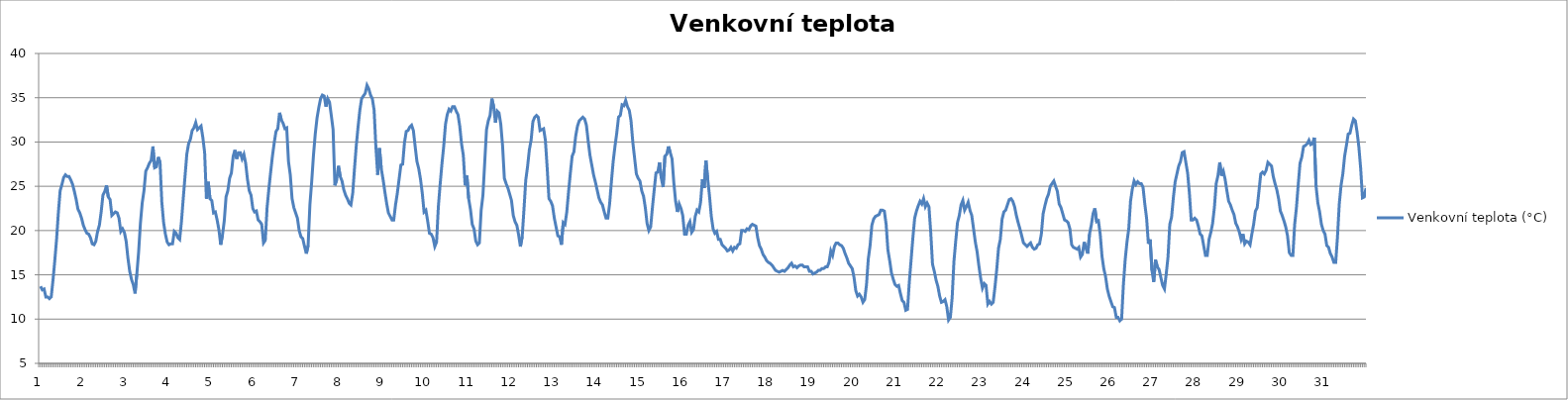
| Category | Venkovní teplota (°C) |
|---|---|
| 0 | 13.7 |
| 1 | 13.3 |
| 2 | 13.4 |
| 3 | 12.5 |
| 4 | 12.5 |
| 5 | 12.3 |
| 6 | 12.5 |
| 7 | 14.4 |
| 8 | 16.6 |
| 9 | 19 |
| 10 | 22 |
| 11 | 24.5 |
| 12 | 25.2 |
| 13 | 26 |
| 14 | 26.3 |
| 15 | 26.1 |
| 16 | 26.1 |
| 17 | 25.7 |
| 18 | 25.2 |
| 19 | 24.4 |
| 20 | 23.5 |
| 21 | 22.4 |
| 22 | 22 |
| 23 | 21.4 |
| 24 | 20.6 |
| 25 | 20.1 |
| 26 | 19.7 |
| 27 | 19.6 |
| 28 | 19.2 |
| 29 | 18.5 |
| 30 | 18.4 |
| 31 | 18.8 |
| 32 | 19.9 |
| 33 | 20.6 |
| 34 | 22.1 |
| 35 | 24 |
| 36 | 24.4 |
| 37 | 25.1 |
| 38 | 23.8 |
| 39 | 23.5 |
| 40 | 21.7 |
| 41 | 21.9 |
| 42 | 22.1 |
| 43 | 22 |
| 44 | 21.4 |
| 45 | 19.9 |
| 46 | 20.2 |
| 47 | 19.8 |
| 48 | 18.8 |
| 49 | 16.9 |
| 50 | 15.4 |
| 51 | 14.5 |
| 52 | 13.9 |
| 53 | 12.9 |
| 54 | 15.1 |
| 55 | 17.6 |
| 56 | 20.8 |
| 57 | 23.1 |
| 58 | 24.5 |
| 59 | 26.7 |
| 60 | 27.1 |
| 61 | 27.6 |
| 62 | 27.9 |
| 63 | 29.5 |
| 64 | 27.1 |
| 65 | 27.2 |
| 66 | 28.3 |
| 67 | 27.7 |
| 68 | 23.2 |
| 69 | 20.9 |
| 70 | 19.6 |
| 71 | 18.7 |
| 72 | 18.4 |
| 73 | 18.5 |
| 74 | 18.5 |
| 75 | 19.9 |
| 76 | 19.7 |
| 77 | 19.2 |
| 78 | 19 |
| 79 | 21 |
| 80 | 23.6 |
| 81 | 26.1 |
| 82 | 28.6 |
| 83 | 29.8 |
| 84 | 30.3 |
| 85 | 31.3 |
| 86 | 31.6 |
| 87 | 32.2 |
| 88 | 31.4 |
| 89 | 31.6 |
| 90 | 31.8 |
| 91 | 30.5 |
| 92 | 28.8 |
| 93 | 23.6 |
| 94 | 25.5 |
| 95 | 23.6 |
| 96 | 23.4 |
| 97 | 22 |
| 98 | 22.1 |
| 99 | 21.2 |
| 100 | 20.1 |
| 101 | 18.4 |
| 102 | 19.5 |
| 103 | 21.1 |
| 104 | 23.8 |
| 105 | 24.5 |
| 106 | 25.9 |
| 107 | 26.5 |
| 108 | 28.4 |
| 109 | 29.1 |
| 110 | 28.1 |
| 111 | 28.8 |
| 112 | 28.8 |
| 113 | 28.1 |
| 114 | 28.6 |
| 115 | 27.6 |
| 116 | 25.8 |
| 117 | 24.5 |
| 118 | 24 |
| 119 | 22.5 |
| 120 | 22.1 |
| 121 | 22.2 |
| 122 | 21.2 |
| 123 | 21 |
| 124 | 20.7 |
| 125 | 18.6 |
| 126 | 18.9 |
| 127 | 22.6 |
| 128 | 24.7 |
| 129 | 26.6 |
| 130 | 28.4 |
| 131 | 29.9 |
| 132 | 31.2 |
| 133 | 31.5 |
| 134 | 33.3 |
| 135 | 32.5 |
| 136 | 32.1 |
| 137 | 31.5 |
| 138 | 31.6 |
| 139 | 27.8 |
| 140 | 26.3 |
| 141 | 23.6 |
| 142 | 22.6 |
| 143 | 22 |
| 144 | 21.4 |
| 145 | 20 |
| 146 | 19.3 |
| 147 | 19.1 |
| 148 | 18.2 |
| 149 | 17.4 |
| 150 | 18.3 |
| 151 | 22.9 |
| 152 | 25.5 |
| 153 | 28.5 |
| 154 | 30.9 |
| 155 | 32.7 |
| 156 | 33.9 |
| 157 | 34.9 |
| 158 | 35.3 |
| 159 | 35.2 |
| 160 | 34 |
| 161 | 34.9 |
| 162 | 34.5 |
| 163 | 33 |
| 164 | 31.4 |
| 165 | 25.1 |
| 166 | 25.7 |
| 167 | 27.3 |
| 168 | 26.1 |
| 169 | 25.6 |
| 170 | 24.6 |
| 171 | 24 |
| 172 | 23.6 |
| 173 | 23.1 |
| 174 | 22.9 |
| 175 | 24.2 |
| 176 | 27 |
| 177 | 29.6 |
| 178 | 31.7 |
| 179 | 33.6 |
| 180 | 34.9 |
| 181 | 35.2 |
| 182 | 35.5 |
| 183 | 36.4 |
| 184 | 36 |
| 185 | 35.3 |
| 186 | 34.9 |
| 187 | 33.6 |
| 188 | 29.4 |
| 189 | 26.3 |
| 190 | 29.3 |
| 191 | 27 |
| 192 | 25.8 |
| 193 | 24.4 |
| 194 | 23.1 |
| 195 | 22 |
| 196 | 21.6 |
| 197 | 21.2 |
| 198 | 21.2 |
| 199 | 22.9 |
| 200 | 24.2 |
| 201 | 25.8 |
| 202 | 27.4 |
| 203 | 27.5 |
| 204 | 29.9 |
| 205 | 31.2 |
| 206 | 31.3 |
| 207 | 31.7 |
| 208 | 31.9 |
| 209 | 31.3 |
| 210 | 29.5 |
| 211 | 27.8 |
| 212 | 27 |
| 213 | 25.8 |
| 214 | 24.2 |
| 215 | 22.1 |
| 216 | 22.3 |
| 217 | 21.1 |
| 218 | 19.7 |
| 219 | 19.6 |
| 220 | 19.2 |
| 221 | 18.2 |
| 222 | 18.7 |
| 223 | 22.7 |
| 224 | 25.2 |
| 225 | 27.5 |
| 226 | 29.5 |
| 227 | 32 |
| 228 | 33.1 |
| 229 | 33.7 |
| 230 | 33.5 |
| 231 | 34 |
| 232 | 34 |
| 233 | 33.5 |
| 234 | 33.1 |
| 235 | 31.8 |
| 236 | 29.8 |
| 237 | 28.5 |
| 238 | 25.1 |
| 239 | 26.2 |
| 240 | 23.6 |
| 241 | 22.4 |
| 242 | 20.7 |
| 243 | 20.2 |
| 244 | 18.8 |
| 245 | 18.4 |
| 246 | 18.6 |
| 247 | 22.3 |
| 248 | 24 |
| 249 | 27.7 |
| 250 | 31.4 |
| 251 | 32.4 |
| 252 | 33 |
| 253 | 34.9 |
| 254 | 34 |
| 255 | 32.2 |
| 256 | 33.5 |
| 257 | 33.3 |
| 258 | 32 |
| 259 | 29.6 |
| 260 | 25.9 |
| 261 | 25.3 |
| 262 | 24.8 |
| 263 | 24.1 |
| 264 | 23.4 |
| 265 | 21.7 |
| 266 | 21 |
| 267 | 20.6 |
| 268 | 19.5 |
| 269 | 18.2 |
| 270 | 19.3 |
| 271 | 22.4 |
| 272 | 25.7 |
| 273 | 27.2 |
| 274 | 29.1 |
| 275 | 30.2 |
| 276 | 32.3 |
| 277 | 32.8 |
| 278 | 33 |
| 279 | 32.8 |
| 280 | 31.3 |
| 281 | 31.4 |
| 282 | 31.5 |
| 283 | 30.2 |
| 284 | 27.1 |
| 285 | 23.6 |
| 286 | 23.3 |
| 287 | 22.8 |
| 288 | 21.4 |
| 289 | 20.4 |
| 290 | 19.4 |
| 291 | 19.3 |
| 292 | 18.4 |
| 293 | 20.9 |
| 294 | 20.7 |
| 295 | 22.1 |
| 296 | 24.4 |
| 297 | 26.5 |
| 298 | 28.4 |
| 299 | 28.9 |
| 300 | 30.7 |
| 301 | 31.8 |
| 302 | 32.4 |
| 303 | 32.6 |
| 304 | 32.8 |
| 305 | 32.6 |
| 306 | 31.9 |
| 307 | 30.1 |
| 308 | 28.5 |
| 309 | 27.4 |
| 310 | 26.3 |
| 311 | 25.5 |
| 312 | 24.6 |
| 313 | 23.7 |
| 314 | 23.2 |
| 315 | 22.9 |
| 316 | 22.1 |
| 317 | 21.4 |
| 318 | 21.4 |
| 319 | 23 |
| 320 | 25.5 |
| 321 | 27.8 |
| 322 | 29.5 |
| 323 | 31 |
| 324 | 32.8 |
| 325 | 33 |
| 326 | 34.2 |
| 327 | 34.1 |
| 328 | 34.7 |
| 329 | 34 |
| 330 | 33.6 |
| 331 | 32.4 |
| 332 | 30 |
| 333 | 28.2 |
| 334 | 26.4 |
| 335 | 25.9 |
| 336 | 25.6 |
| 337 | 24.5 |
| 338 | 23.9 |
| 339 | 22.6 |
| 340 | 20.8 |
| 341 | 20 |
| 342 | 20.4 |
| 343 | 22.6 |
| 344 | 24.6 |
| 345 | 26.5 |
| 346 | 26.6 |
| 347 | 27.7 |
| 348 | 25.9 |
| 349 | 24.9 |
| 350 | 28.4 |
| 351 | 28.6 |
| 352 | 29.5 |
| 353 | 28.8 |
| 354 | 28.1 |
| 355 | 25.4 |
| 356 | 23.3 |
| 357 | 22.1 |
| 358 | 23 |
| 359 | 22.5 |
| 360 | 21.7 |
| 361 | 19.6 |
| 362 | 19.6 |
| 363 | 20.6 |
| 364 | 21 |
| 365 | 19.8 |
| 366 | 20.1 |
| 367 | 21.6 |
| 368 | 22.3 |
| 369 | 22.1 |
| 370 | 23.2 |
| 371 | 25.8 |
| 372 | 24.8 |
| 373 | 27.9 |
| 374 | 25.8 |
| 375 | 23.9 |
| 376 | 21.6 |
| 377 | 20.2 |
| 378 | 19.7 |
| 379 | 19.9 |
| 380 | 19 |
| 381 | 19 |
| 382 | 18.4 |
| 383 | 18.2 |
| 384 | 18 |
| 385 | 17.7 |
| 386 | 17.8 |
| 387 | 18.1 |
| 388 | 17.7 |
| 389 | 18.1 |
| 390 | 18 |
| 391 | 18.4 |
| 392 | 18.5 |
| 393 | 20 |
| 394 | 20 |
| 395 | 19.9 |
| 396 | 20.2 |
| 397 | 20.1 |
| 398 | 20.5 |
| 399 | 20.7 |
| 400 | 20.6 |
| 401 | 20.5 |
| 402 | 19.2 |
| 403 | 18.3 |
| 404 | 17.9 |
| 405 | 17.3 |
| 406 | 17 |
| 407 | 16.6 |
| 408 | 16.4 |
| 409 | 16.3 |
| 410 | 16.1 |
| 411 | 15.8 |
| 412 | 15.5 |
| 413 | 15.4 |
| 414 | 15.3 |
| 415 | 15.4 |
| 416 | 15.5 |
| 417 | 15.4 |
| 418 | 15.6 |
| 419 | 15.8 |
| 420 | 16.1 |
| 421 | 16.3 |
| 422 | 15.9 |
| 423 | 16 |
| 424 | 15.8 |
| 425 | 16 |
| 426 | 16.1 |
| 427 | 16.1 |
| 428 | 15.9 |
| 429 | 15.9 |
| 430 | 15.9 |
| 431 | 15.4 |
| 432 | 15.4 |
| 433 | 15.1 |
| 434 | 15.2 |
| 435 | 15.3 |
| 436 | 15.5 |
| 437 | 15.5 |
| 438 | 15.7 |
| 439 | 15.7 |
| 440 | 15.9 |
| 441 | 15.9 |
| 442 | 16.4 |
| 443 | 17.7 |
| 444 | 17.2 |
| 445 | 18.2 |
| 446 | 18.6 |
| 447 | 18.6 |
| 448 | 18.4 |
| 449 | 18.3 |
| 450 | 18 |
| 451 | 17.4 |
| 452 | 16.9 |
| 453 | 16.3 |
| 454 | 16 |
| 455 | 15.7 |
| 456 | 14.7 |
| 457 | 13.2 |
| 458 | 12.6 |
| 459 | 12.8 |
| 460 | 12.5 |
| 461 | 11.9 |
| 462 | 12.2 |
| 463 | 13.9 |
| 464 | 16.8 |
| 465 | 18.3 |
| 466 | 20.6 |
| 467 | 21.3 |
| 468 | 21.6 |
| 469 | 21.7 |
| 470 | 21.8 |
| 471 | 22.3 |
| 472 | 22.3 |
| 473 | 22.2 |
| 474 | 20.7 |
| 475 | 17.8 |
| 476 | 16.6 |
| 477 | 15.2 |
| 478 | 14.5 |
| 479 | 13.9 |
| 480 | 13.7 |
| 481 | 13.8 |
| 482 | 12.9 |
| 483 | 12.1 |
| 484 | 11.9 |
| 485 | 11 |
| 486 | 11.1 |
| 487 | 14.2 |
| 488 | 16.7 |
| 489 | 19.2 |
| 490 | 21.4 |
| 491 | 22.2 |
| 492 | 22.8 |
| 493 | 23.3 |
| 494 | 23 |
| 495 | 23.6 |
| 496 | 22.7 |
| 497 | 23.1 |
| 498 | 22.7 |
| 499 | 19.8 |
| 500 | 16.2 |
| 501 | 15.4 |
| 502 | 14.4 |
| 503 | 13.7 |
| 504 | 12.6 |
| 505 | 11.9 |
| 506 | 12 |
| 507 | 12.2 |
| 508 | 11.4 |
| 509 | 9.9 |
| 510 | 10.2 |
| 511 | 12.4 |
| 512 | 16.5 |
| 513 | 18.8 |
| 514 | 20.9 |
| 515 | 21.7 |
| 516 | 22.9 |
| 517 | 23.4 |
| 518 | 22.3 |
| 519 | 22.7 |
| 520 | 23.2 |
| 521 | 22.3 |
| 522 | 21.7 |
| 523 | 20.2 |
| 524 | 18.7 |
| 525 | 17.6 |
| 526 | 16 |
| 527 | 14.6 |
| 528 | 13.5 |
| 529 | 14 |
| 530 | 13.8 |
| 531 | 11.7 |
| 532 | 12 |
| 533 | 11.7 |
| 534 | 11.9 |
| 535 | 13.6 |
| 536 | 15.6 |
| 537 | 18 |
| 538 | 19 |
| 539 | 21.3 |
| 540 | 22.1 |
| 541 | 22.3 |
| 542 | 22.9 |
| 543 | 23.5 |
| 544 | 23.6 |
| 545 | 23.3 |
| 546 | 22.7 |
| 547 | 21.7 |
| 548 | 20.9 |
| 549 | 20.2 |
| 550 | 19.4 |
| 551 | 18.6 |
| 552 | 18.4 |
| 553 | 18.2 |
| 554 | 18.4 |
| 555 | 18.6 |
| 556 | 18.1 |
| 557 | 17.9 |
| 558 | 18 |
| 559 | 18.4 |
| 560 | 18.5 |
| 561 | 19.6 |
| 562 | 21.9 |
| 563 | 22.8 |
| 564 | 23.6 |
| 565 | 24.1 |
| 566 | 25 |
| 567 | 25.3 |
| 568 | 25.6 |
| 569 | 25 |
| 570 | 24.4 |
| 571 | 23 |
| 572 | 22.6 |
| 573 | 21.9 |
| 574 | 21.2 |
| 575 | 21.1 |
| 576 | 20.9 |
| 577 | 20.2 |
| 578 | 18.4 |
| 579 | 18.1 |
| 580 | 18 |
| 581 | 17.9 |
| 582 | 18.1 |
| 583 | 17 |
| 584 | 17.3 |
| 585 | 18.7 |
| 586 | 18 |
| 587 | 17.4 |
| 588 | 19.6 |
| 589 | 20.6 |
| 590 | 21.9 |
| 591 | 22.5 |
| 592 | 21 |
| 593 | 21.1 |
| 594 | 19.6 |
| 595 | 17.1 |
| 596 | 15.7 |
| 597 | 14.8 |
| 598 | 13.4 |
| 599 | 12.6 |
| 600 | 12 |
| 601 | 11.4 |
| 602 | 11.3 |
| 603 | 10.2 |
| 604 | 10.2 |
| 605 | 9.8 |
| 606 | 10 |
| 607 | 13.9 |
| 608 | 16.7 |
| 609 | 18.7 |
| 610 | 20.2 |
| 611 | 23.3 |
| 612 | 24.7 |
| 613 | 25.6 |
| 614 | 25.2 |
| 615 | 25.5 |
| 616 | 25.3 |
| 617 | 25.3 |
| 618 | 24.9 |
| 619 | 23 |
| 620 | 21.4 |
| 621 | 18.5 |
| 622 | 19 |
| 623 | 15.5 |
| 624 | 14.2 |
| 625 | 16.7 |
| 626 | 15.9 |
| 627 | 15.6 |
| 628 | 14.7 |
| 629 | 13.8 |
| 630 | 13.4 |
| 631 | 15.1 |
| 632 | 17 |
| 633 | 20.7 |
| 634 | 21.5 |
| 635 | 23.7 |
| 636 | 25.5 |
| 637 | 26.4 |
| 638 | 27.3 |
| 639 | 27.8 |
| 640 | 28.8 |
| 641 | 28.9 |
| 642 | 27.7 |
| 643 | 26.5 |
| 644 | 24.2 |
| 645 | 21.2 |
| 646 | 21.2 |
| 647 | 21.4 |
| 648 | 21.2 |
| 649 | 20.5 |
| 650 | 19.6 |
| 651 | 19.4 |
| 652 | 18.3 |
| 653 | 17.2 |
| 654 | 17.2 |
| 655 | 19 |
| 656 | 19.8 |
| 657 | 20.8 |
| 658 | 22.6 |
| 659 | 25.3 |
| 660 | 26.2 |
| 661 | 27.7 |
| 662 | 26.2 |
| 663 | 26.7 |
| 664 | 25.8 |
| 665 | 24.5 |
| 666 | 23.3 |
| 667 | 22.9 |
| 668 | 22.3 |
| 669 | 21.8 |
| 670 | 20.8 |
| 671 | 20.4 |
| 672 | 19.8 |
| 673 | 19 |
| 674 | 19.6 |
| 675 | 18.5 |
| 676 | 18.8 |
| 677 | 18.7 |
| 678 | 18.4 |
| 679 | 19.6 |
| 680 | 20.7 |
| 681 | 22.2 |
| 682 | 22.6 |
| 683 | 24.5 |
| 684 | 26.4 |
| 685 | 26.6 |
| 686 | 26.4 |
| 687 | 26.8 |
| 688 | 27.7 |
| 689 | 27.5 |
| 690 | 27.3 |
| 691 | 26.1 |
| 692 | 25.3 |
| 693 | 24.6 |
| 694 | 23.6 |
| 695 | 22.2 |
| 696 | 21.7 |
| 697 | 21.1 |
| 698 | 20.4 |
| 699 | 19.4 |
| 700 | 17.5 |
| 701 | 17.2 |
| 702 | 17.2 |
| 703 | 20.7 |
| 704 | 22.6 |
| 705 | 25.2 |
| 706 | 27.6 |
| 707 | 28.3 |
| 708 | 29.5 |
| 709 | 29.6 |
| 710 | 29.8 |
| 711 | 30.2 |
| 712 | 29.7 |
| 713 | 29.8 |
| 714 | 30.5 |
| 715 | 25 |
| 716 | 23.1 |
| 717 | 22.1 |
| 718 | 20.7 |
| 719 | 20 |
| 720 | 19.6 |
| 721 | 18.3 |
| 722 | 18.1 |
| 723 | 17.4 |
| 724 | 17 |
| 725 | 16.4 |
| 726 | 16.4 |
| 727 | 19.3 |
| 728 | 23 |
| 729 | 25.1 |
| 730 | 26.4 |
| 731 | 28.4 |
| 732 | 29.6 |
| 733 | 30.9 |
| 734 | 31 |
| 735 | 31.9 |
| 736 | 32.6 |
| 737 | 32.4 |
| 738 | 31.1 |
| 739 | 29.4 |
| 740 | 27 |
| 741 | 23.7 |
| 742 | 23.8 |
| 743 | 24.8 |